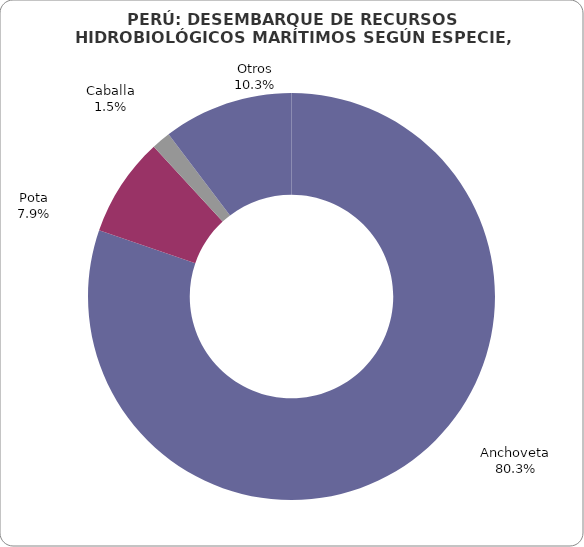
| Category | Series 0 |
|---|---|
| Anchoveta | 5269216.352 |
| Pota | 517709.843 |
| Caballa | 98784.57 |
| Otros | 677648.546 |